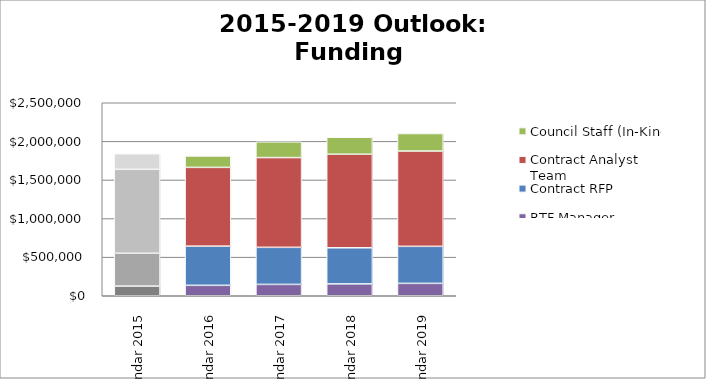
| Category | RTF Manager | Contract RFP | Contract Analyst Team | Council Staff (In-Kind) |
|---|---|---|---|---|
| Calendar 2015 | 125000 | 425600 | 1087000 | 201600 |
| Calendar 2016 | 135000 | 508000 | 1020000 | 148100 |
| Calendar 2017 | 147000 | 480300 | 1162500 | 204200 |
| Calendar 2018 | 153700 | 467800 | 1212000 | 219400 |
| Calendar 2019 | 160700 | 479600 | 1234600 | 226400 |